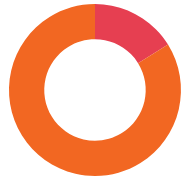
| Category | ĮSIPAREIGOJIMAI |
|---|---|
| NEAPDRAUSTA | 35700 |
| APDRAUSTA | 185500 |